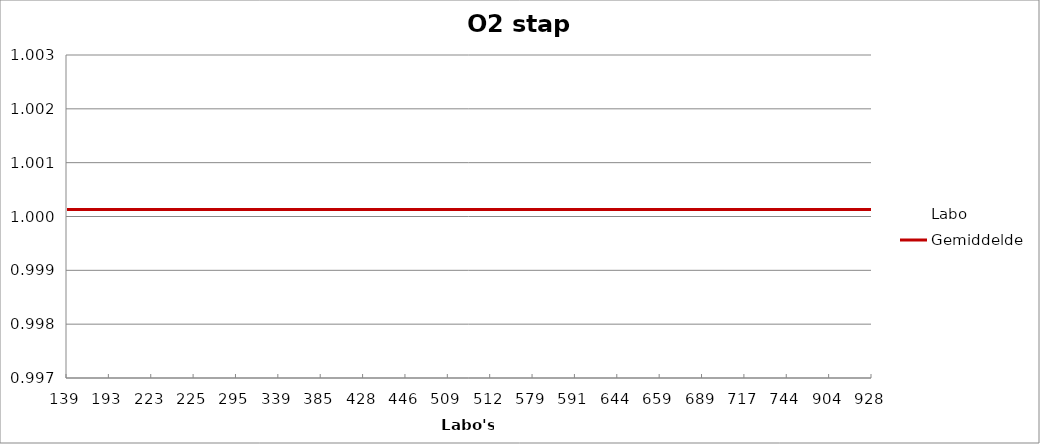
| Category | Labo | Gemiddelde |
|---|---|---|
| 139.0 | 1.001 | 1 |
| 193.0 | 1 | 1 |
| 223.0 | 1.001 | 1 |
| 225.0 | 1.001 | 1 |
| 295.0 | 1 | 1 |
| 339.0 | 1 | 1 |
| 385.0 | 1 | 1 |
| 428.0 | 1 | 1 |
| 446.0 | 1 | 1 |
| 509.0 | 1 | 1 |
| 512.0 | 1 | 1 |
| 579.0 | 1 | 1 |
| 591.0 | 1 | 1 |
| 644.0 | 1 | 1 |
| 659.0 | 1 | 1 |
| 689.0 | 1 | 1 |
| 717.0 | 0.999 | 1 |
| 744.0 | 1 | 1 |
| 904.0 | 1 | 1 |
| 928.0 | 0.997 | 1 |